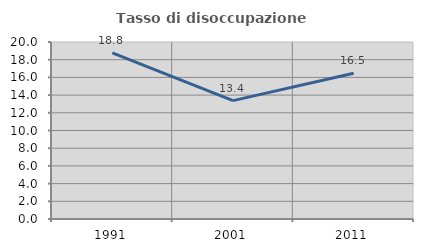
| Category | Tasso di disoccupazione giovanile  |
|---|---|
| 1991.0 | 18.776 |
| 2001.0 | 13.372 |
| 2011.0 | 16.463 |